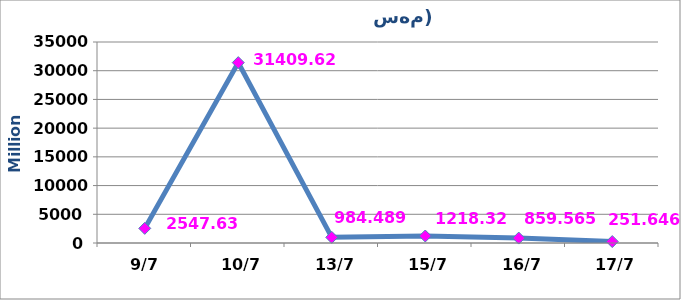
| Category | عدد الاسهم |
|---|---|
|  9/7 | 2547632502 |
|  10/7 | 31409626110 |
|  13/7 | 984489339 |
|  15/7 | 1218327177 |
|  16/7 | 859564766 |
|  17/7 | 251646180 |